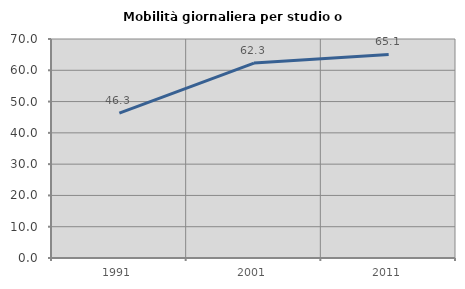
| Category | Mobilità giornaliera per studio o lavoro |
|---|---|
| 1991.0 | 46.292 |
| 2001.0 | 62.313 |
| 2011.0 | 65.064 |